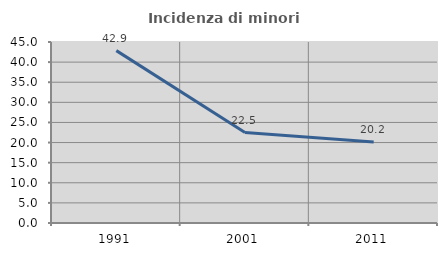
| Category | Incidenza di minori stranieri |
|---|---|
| 1991.0 | 42.857 |
| 2001.0 | 22.5 |
| 2011.0 | 20.155 |